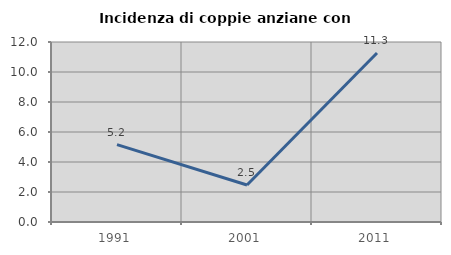
| Category | Incidenza di coppie anziane con figli |
|---|---|
| 1991.0 | 5.155 |
| 2001.0 | 2.469 |
| 2011.0 | 11.268 |